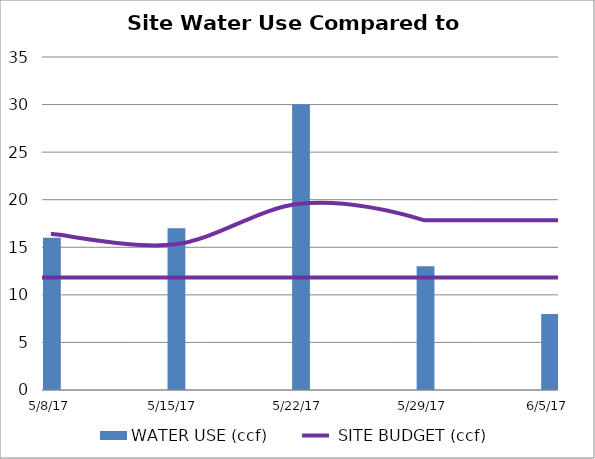
| Category | WATER USE (ccf)  |
|---|---|
| 5/8/17 | 16 |
| 5/15/17 | 17 |
| 5/22/17 | 30 |
| 5/29/17 | 13 |
| 6/5/17 | 8 |
| nan | 0 |
| nan | 0 |
| nan | 0 |
| nan | 0 |
| nan | 0 |
| nan | 0 |
| nan | 0 |
| nan | 0 |
| nan | 0 |
| nan | 0 |
| nan | 0 |
| nan | 0 |
| nan | 0 |
| nan | 0 |
| nan | 0 |
| nan | 0 |
| nan | 0 |
| nan | 0 |
| nan | 0 |
| nan | 0 |
| nan | 0 |
| nan | 0 |
| nan | 0 |
| nan | 0 |
| nan | 0 |
| nan | 0 |
| nan | 0 |
| nan | 0 |
| nan | 0 |
| nan | 0 |
| nan | 0 |
| nan | 0 |
| nan | 0 |
| nan | 0 |
| nan | 0 |
| nan | 0 |
| nan | 0 |
| nan | 0 |
| nan | 0 |
| nan | 0 |
| nan | 0 |
| nan | 0 |
| nan | 0 |
| nan | 0 |
| nan | 0 |
| nan | 0 |
| nan | 0 |
| nan | 0 |
| nan | 0 |
| nan | 0 |
| nan | 0 |
| nan | 0 |
| nan | 0 |
| nan | 0 |
| nan | 0 |
| nan | 0 |
| nan | 0 |
| nan | 0 |
| nan | 0 |
| nan | 0 |
| nan | 0 |
| nan | 0 |
| nan | 0 |
| nan | 0 |
| nan | 0 |
| nan | 0 |
| nan | 0 |
| nan | 0 |
| nan | 0 |
| nan | 0 |
| nan | 0 |
| nan | 0 |
| nan | 0 |
| nan | 0 |
| nan | 0 |
| nan | 0 |
| nan | 0 |
| nan | 0 |
| nan | 0 |
| nan | 0 |
| nan | 0 |
| nan | 0 |
| nan | 0 |
| nan | 0 |
| nan | 0 |
| nan | 0 |
| nan | 0 |
| nan | 0 |
| nan | 0 |
| nan | 0 |
| nan | 0 |
| nan | 0 |
| nan | 0 |
| nan | 0 |
| nan | 0 |
| nan | 0 |
| nan | 0 |
| nan | 0 |
| nan | 0 |
| nan | 0 |
| nan | 0 |
| nan | 0 |
| nan | 0 |
| nan | 0 |
| nan | 0 |
| nan | 0 |
| nan | 0 |
| nan | 0 |
| nan | 0 |
| nan | 0 |
| nan | 0 |
| nan | 0 |
| nan | 0 |
| nan | 0 |
| nan | 0 |
| nan | 0 |
| nan | 0 |
| nan | 0 |
| nan | 0 |
| nan | 0 |
| nan | 0 |
| nan | 0 |
| nan | 0 |
| nan | 0 |
| nan | 0 |
| nan | 0 |
| nan | 0 |
| nan | 0 |
| nan | 0 |
| nan | 0 |
| nan | 0 |
| nan | 0 |
| nan | 0 |
| nan | 0 |
| nan | 0 |
| nan | 0 |
| nan | 0 |
| nan | 0 |
| nan | 0 |
| nan | 0 |
| nan | 0 |
| nan | 0 |
| nan | 0 |
| nan | 0 |
| nan | 0 |
| nan | 0 |
| nan | 0 |
| nan | 0 |
| nan | 0 |
| nan | 0 |
| nan | 0 |
| nan | 0 |
| nan | 0 |
| nan | 0 |
| nan | 0 |
| nan | 0 |
| nan | 0 |
| nan | 0 |
| nan | 0 |
| nan | 0 |
| nan | 0 |
| nan | 0 |
| nan | 0 |
| nan | 0 |
| nan | 0 |
| nan | 0 |
| nan | 0 |
| nan | 0 |
| nan | 0 |
| nan | 0 |
| nan | 0 |
| nan | 0 |
| nan | 0 |
| nan | 0 |
| nan | 0 |
| nan | 0 |
| nan | 0 |
| nan | 0 |
| nan | 0 |
| nan | 0 |
| nan | 0 |
| nan | 0 |
| nan | 0 |
| nan | 0 |
| nan | 0 |
| nan | 0 |
| nan | 0 |
| nan | 0 |
| nan | 0 |
| nan | 0 |
| nan | 0 |
| nan | 0 |
| nan | 0 |
| nan | 0 |
| nan | 0 |
| nan | 0 |
| nan | 0 |
| nan | 0 |
| nan | 0 |
| nan | 0 |
| nan | 0 |
| nan | 0 |
| nan | 0 |
| nan | 0 |
| nan | 0 |
| nan | 0 |
| nan | 0 |
| nan | 0 |
| nan | 0 |
| nan | 0 |
| nan | 0 |
| nan | 0 |
| nan | 0 |
| nan | 0 |
| nan | 0 |
| nan | 0 |
| nan | 0 |
| nan | 0 |
| nan | 0 |
| nan | 0 |
| nan | 0 |
| nan | 0 |
| nan | 0 |
| nan | 0 |
| nan | 0 |
| nan | 0 |
| nan | 0 |
| nan | 0 |
| nan | 0 |
| nan | 0 |
| nan | 0 |
| nan | 0 |
| nan | 0 |
| nan | 0 |
| nan | 0 |
| nan | 0 |
| nan | 0 |
| nan | 0 |
| nan | 0 |
| nan | 0 |
| nan | 0 |
| nan | 0 |
| nan | 0 |
| nan | 0 |
| nan | 0 |
| nan | 0 |
| nan | 0 |
| nan | 0 |
| nan | 0 |
| nan | 0 |
| nan | 0 |
| nan | 0 |
| nan | 0 |
| nan | 0 |
| nan | 0 |
| nan | 0 |
| nan | 0 |
| nan | 0 |
| nan | 0 |
| nan | 0 |
| nan | 0 |
| nan | 0 |
| nan | 0 |
| nan | 0 |
| nan | 0 |
| nan | 0 |
| nan | 0 |
| nan | 0 |
| nan | 0 |
| nan | 0 |
| nan | 0 |
| nan | 0 |
| nan | 0 |
| nan | 0 |
| nan | 0 |
| nan | 0 |
| nan | 0 |
| nan | 0 |
| nan | 0 |
| nan | 0 |
| nan | 0 |
| nan | 0 |
| nan | 0 |
| nan | 0 |
| nan | 0 |
| nan | 0 |
| nan | 0 |
| nan | 0 |
| nan | 0 |
| nan | 0 |
| nan | 0 |
| nan | 0 |
| nan | 0 |
| nan | 0 |
| nan | 0 |
| nan | 0 |
| nan | 0 |
| nan | 0 |
| nan | 0 |
| nan | 0 |
| nan | 0 |
| nan | 0 |
| nan | 0 |
| nan | 0 |
| nan | 0 |
| nan | 0 |
| nan | 0 |
| nan | 0 |
| nan | 0 |
| nan | 0 |
| nan | 0 |
| nan | 0 |
| nan | 0 |
| nan | 0 |
| nan | 0 |
| nan | 0 |
| nan | 0 |
| nan | 0 |
| nan | 0 |
| nan | 0 |
| nan | 0 |
| nan | 0 |
| nan | 0 |
| nan | 0 |
| nan | 0 |
| nan | 0 |
| nan | 0 |
| nan | 0 |
| nan | 0 |
| nan | 0 |
| nan | 0 |
| nan | 0 |
| nan | 0 |
| nan | 0 |
| nan | 0 |
| nan | 0 |
| nan | 0 |
| nan | 0 |
| nan | 0 |
| nan | 0 |
| nan | 0 |
| nan | 0 |
| nan | 0 |
| nan | 0 |
| nan | 0 |
| nan | 0 |
| nan | 0 |
| nan | 0 |
| nan | 0 |
| nan | 0 |
| nan | 0 |
| nan | 0 |
| nan | 0 |
| nan | 0 |
| nan | 0 |
| nan | 0 |
| nan | 0 |
| nan | 0 |
| nan | 0 |
| nan | 0 |
| nan | 0 |
| nan | 0 |
| nan | 0 |
| nan | 0 |
| nan | 0 |
| nan | 0 |
| nan | 0 |
| nan | 0 |
| nan | 0 |
| nan | 0 |
| nan | 0 |
| nan | 0 |
| nan | 0 |
| nan | 0 |
| nan | 0 |
| nan | 0 |
| nan | 0 |
| nan | 0 |
| nan | 0 |
| nan | 0 |
| nan | 0 |
| nan | 0 |
| nan | 0 |
| nan | 0 |
| nan | 0 |
| nan | 0 |
| nan | 0 |
| nan | 0 |
| nan | 0 |
| nan | 0 |
| nan | 0 |
| nan | 0 |
| nan | 0 |
| nan | 0 |
| nan | 0 |
| nan | 0 |
| nan | 0 |
| nan | 0 |
| nan | 0 |
| nan | 0 |
| nan | 0 |
| nan | 0 |
| nan | 0 |
| nan | 0 |
| nan | 0 |
| nan | 0 |
| nan | 0 |
| nan | 0 |
| nan | 0 |
| nan | 0 |
| nan | 0 |
| nan | 0 |
| nan | 0 |
| nan | 0 |
| nan | 0 |
| nan | 0 |
| nan | 0 |
| nan | 0 |
| nan | 0 |
| nan | 0 |
| nan | 0 |
| nan | 0 |
| nan | 0 |
| nan | 0 |
| nan | 0 |
| nan | 0 |
| nan | 0 |
| nan | 0 |
| nan | 0 |
| nan | 0 |
| nan | 0 |
| nan | 0 |
| nan | 0 |
| nan | 0 |
| nan | 0 |
| nan | 0 |
| nan | 0 |
| nan | 0 |
| nan | 0 |
| nan | 0 |
| nan | 0 |
| nan | 0 |
| nan | 0 |
| nan | 0 |
| nan | 0 |
| nan | 0 |
| nan | 0 |
| nan | 0 |
| nan | 0 |
| nan | 0 |
| nan | 0 |
| nan | 0 |
| nan | 0 |
| nan | 0 |
| nan | 0 |
| nan | 0 |
| nan | 0 |
| nan | 0 |
| nan | 0 |
| nan | 0 |
| nan | 0 |
| nan | 0 |
| nan | 0 |
| nan | 0 |
| nan | 0 |
| nan | 0 |
| nan | 0 |
| nan | 0 |
| nan | 0 |
| nan | 0 |
| nan | 0 |
| nan | 0 |
| nan | 0 |
| nan | 0 |
| nan | 0 |
| nan | 0 |
| nan | 0 |
| nan | 0 |
| nan | 0 |
| nan | 0 |
| nan | 0 |
| nan | 0 |
| nan | 0 |
| nan | 0 |
| nan | 0 |
| nan | 0 |
| nan | 0 |
| nan | 0 |
| nan | 0 |
| nan | 0 |
| nan | 0 |
| nan | 0 |
| nan | 0 |
| nan | 0 |
| nan | 0 |
| nan | 0 |
| nan | 0 |
| nan | 0 |
| nan | 0 |
| nan | 0 |
| nan | 0 |
| nan | 0 |
| nan | 0 |
| nan | 0 |
| nan | 0 |
| nan | 0 |
| nan | 0 |
| nan | 0 |
| nan | 0 |
| nan | 0 |
| nan | 0 |
| nan | 0 |
| nan | 0 |
| nan | 0 |
| nan | 0 |
| nan | 0 |
| nan | 0 |
| nan | 0 |
| nan | 0 |
| nan | 0 |
| nan | 0 |
| nan | 0 |
| nan | 0 |
| nan | 0 |
| nan | 0 |
| nan | 0 |
| nan | 0 |
| nan | 0 |
| nan | 0 |
| nan | 0 |
| nan | 0 |
| nan | 0 |
| nan | 0 |
| nan | 0 |
| nan | 0 |
| nan | 0 |
| nan | 0 |
| nan | 0 |
| nan | 0 |
| nan | 0 |
| nan | 0 |
| nan | 0 |
| nan | 0 |
| nan | 0 |
| nan | 0 |
| nan | 0 |
| nan | 0 |
| nan | 0 |
| nan | 0 |
| nan | 0 |
| nan | 0 |
| nan | 0 |
| nan | 0 |
| nan | 0 |
| nan | 0 |
| nan | 0 |
| nan | 0 |
| nan | 0 |
| nan | 0 |
| nan | 0 |
| nan | 0 |
| nan | 0 |
| nan | 0 |
| nan | 0 |
| nan | 0 |
| nan | 0 |
| nan | 0 |
| nan | 0 |
| nan | 0 |
| nan | 0 |
| nan | 0 |
| nan | 0 |
| nan | 0 |
| nan | 0 |
| nan | 0 |
| nan | 0 |
| nan | 0 |
| nan | 0 |
| nan | 0 |
| nan | 0 |
| nan | 0 |
| nan | 0 |
| nan | 0 |
| nan | 0 |
| nan | 0 |
| nan | 0 |
| nan | 0 |
| nan | 0 |
| nan | 0 |
| nan | 0 |
| nan | 0 |
| nan | 0 |
| nan | 0 |
| nan | 0 |
| nan | 0 |
| nan | 0 |
| nan | 0 |
| nan | 0 |
| nan | 0 |
| nan | 0 |
| nan | 0 |
| nan | 0 |
| nan | 0 |
| nan | 0 |
| nan | 0 |
| nan | 0 |
| nan | 0 |
| nan | 0 |
| nan | 0 |
| nan | 0 |
| nan | 0 |
| nan | 0 |
| nan | 0 |
| nan | 0 |
| nan | 0 |
| nan | 0 |
| nan | 0 |
| nan | 0 |
| nan | 0 |
| nan | 0 |
| nan | 0 |
| nan | 0 |
| nan | 0 |
| nan | 0 |
| nan | 0 |
| nan | 0 |
| nan | 0 |
| nan | 0 |
| nan | 0 |
| nan | 0 |
| nan | 0 |
| nan | 0 |
| nan | 0 |
| nan | 0 |
| nan | 0 |
| nan | 0 |
| nan | 0 |
| nan | 0 |
| nan | 0 |
| nan | 0 |
| nan | 0 |
| nan | 0 |
| nan | 0 |
| nan | 0 |
| nan | 0 |
| nan | 0 |
| nan | 0 |
| nan | 0 |
| nan | 0 |
| nan | 0 |
| nan | 0 |
| nan | 0 |
| nan | 0 |
| nan | 0 |
| nan | 0 |
| nan | 0 |
| nan | 0 |
| nan | 0 |
| nan | 0 |
| nan | 0 |
| nan | 0 |
| nan | 0 |
| nan | 0 |
| nan | 0 |
| nan | 0 |
| nan | 0 |
| nan | 0 |
| nan | 0 |
| nan | 0 |
| nan | 0 |
| nan | 0 |
| nan | 0 |
| nan | 0 |
| nan | 0 |
| nan | 0 |
| nan | 0 |
| nan | 0 |
| nan | 0 |
| nan | 0 |
| nan | 0 |
| nan | 0 |
| nan | 0 |
| nan | 0 |
| nan | 0 |
| nan | 0 |
| nan | 0 |
| nan | 0 |
| nan | 0 |
| nan | 0 |
| nan | 0 |
| nan | 0 |
| nan | 0 |
| nan | 0 |
| nan | 0 |
| nan | 0 |
| nan | 0 |
| nan | 0 |
| nan | 0 |
| nan | 0 |
| nan | 0 |
| nan | 0 |
| nan | 0 |
| nan | 0 |
| nan | 0 |
| nan | 0 |
| nan | 0 |
| nan | 0 |
| nan | 0 |
| nan | 0 |
| nan | 0 |
| nan | 0 |
| nan | 0 |
| nan | 0 |
| nan | 0 |
| nan | 0 |
| nan | 0 |
| nan | 0 |
| nan | 0 |
| nan | 0 |
| nan | 0 |
| nan | 0 |
| nan | 0 |
| nan | 0 |
| nan | 0 |
| nan | 0 |
| nan | 0 |
| nan | 0 |
| nan | 0 |
| nan | 0 |
| nan | 0 |
| nan | 0 |
| nan | 0 |
| nan | 0 |
| nan | 0 |
| nan | 0 |
| nan | 0 |
| nan | 0 |
| nan | 0 |
| nan | 0 |
| nan | 0 |
| nan | 0 |
| nan | 0 |
| nan | 0 |
| nan | 0 |
| nan | 0 |
| nan | 0 |
| nan | 0 |
| nan | 0 |
| nan | 0 |
| nan | 0 |
| nan | 0 |
| nan | 0 |
| nan | 0 |
| nan | 0 |
| nan | 0 |
| nan | 0 |
| nan | 0 |
| nan | 0 |
| nan | 0 |
| nan | 0 |
| nan | 0 |
| nan | 0 |
| nan | 0 |
| nan | 0 |
| nan | 0 |
| nan | 0 |
| nan | 0 |
| nan | 0 |
| nan | 0 |
| nan | 0 |
| nan | 0 |
| nan | 0 |
| nan | 0 |
| nan | 0 |
| nan | 0 |
| nan | 0 |
| nan | 0 |
| nan | 0 |
| nan | 0 |
| nan | 0 |
| nan | 0 |
| nan | 0 |
| nan | 0 |
| nan | 0 |
| nan | 0 |
| nan | 0 |
| nan | 0 |
| nan | 0 |
| nan | 0 |
| nan | 0 |
| nan | 0 |
| nan | 0 |
| nan | 0 |
| nan | 0 |
| nan | 0 |
| nan | 0 |
| nan | 0 |
| nan | 0 |
| nan | 0 |
| nan | 0 |
| nan | 0 |
| nan | 0 |
| nan | 0 |
| nan | 0 |
| nan | 0 |
| nan | 0 |
| nan | 0 |
| nan | 0 |
| nan | 0 |
| nan | 0 |
| nan | 0 |
| nan | 0 |
| nan | 0 |
| nan | 0 |
| nan | 0 |
| nan | 0 |
| nan | 0 |
| nan | 0 |
| nan | 0 |
| nan | 0 |
| nan | 0 |
| nan | 0 |
| nan | 0 |
| nan | 0 |
| nan | 0 |
| nan | 0 |
| nan | 0 |
| nan | 0 |
| nan | 0 |
| nan | 0 |
| nan | 0 |
| nan | 0 |
| nan | 0 |
| nan | 0 |
| nan | 0 |
| nan | 0 |
| nan | 0 |
| nan | 0 |
| nan | 0 |
| nan | 0 |
| nan | 0 |
| nan | 0 |
| nan | 0 |
| nan | 0 |
| nan | 0 |
| nan | 0 |
| nan | 0 |
| nan | 0 |
| nan | 0 |
| nan | 0 |
| nan | 0 |
| nan | 0 |
| nan | 0 |
| nan | 0 |
| nan | 0 |
| nan | 0 |
| nan | 0 |
| nan | 0 |
| nan | 0 |
| nan | 0 |
| nan | 0 |
| nan | 0 |
| nan | 0 |
| nan | 0 |
| nan | 0 |
| nan | 0 |
| nan | 0 |
| nan | 0 |
| nan | 0 |
| nan | 0 |
| nan | 0 |
| nan | 0 |
| nan | 0 |
| nan | 0 |
| nan | 0 |
| nan | 0 |
| nan | 0 |
| nan | 0 |
| nan | 0 |
| nan | 0 |
| nan | 0 |
| nan | 0 |
| nan | 0 |
| nan | 0 |
| nan | 0 |
| nan | 0 |
| nan | 0 |
| nan | 0 |
| nan | 0 |
| nan | 0 |
| nan | 0 |
| nan | 0 |
| nan | 0 |
| nan | 0 |
| nan | 0 |
| nan | 0 |
| nan | 0 |
| nan | 0 |
| nan | 0 |
| nan | 0 |
| nan | 0 |
| nan | 0 |
| nan | 0 |
| nan | 0 |
| nan | 0 |
| nan | 0 |
| nan | 0 |
| nan | 0 |
| nan | 0 |
| nan | 0 |
| nan | 0 |
| nan | 0 |
| nan | 0 |
| nan | 0 |
| nan | 0 |
| nan | 0 |
| nan | 0 |
| nan | 0 |
| nan | 0 |
| nan | 0 |
| nan | 0 |
| nan | 0 |
| nan | 0 |
| nan | 0 |
| nan | 0 |
| nan | 0 |
| nan | 0 |
| nan | 0 |
| nan | 0 |
| nan | 0 |
| nan | 0 |
| nan | 0 |
| nan | 0 |
| nan | 0 |
| nan | 0 |
| nan | 0 |
| nan | 0 |
| nan | 0 |
| nan | 0 |
| nan | 0 |
| nan | 0 |
| nan | 0 |
| nan | 0 |
| nan | 0 |
| nan | 0 |
| nan | 0 |
| nan | 0 |
| nan | 0 |
| nan | 0 |
| nan | 0 |
| nan | 0 |
| nan | 0 |
| nan | 0 |
| nan | 0 |
| nan | 0 |
| nan | 0 |
| nan | 0 |
| nan | 0 |
| nan | 0 |
| nan | 0 |
| nan | 0 |
| nan | 0 |
| nan | 0 |
| nan | 0 |
| nan | 0 |
| nan | 0 |
| nan | 0 |
| nan | 0 |
| nan | 0 |
| nan | 0 |
| nan | 0 |
| nan | 0 |
| nan | 0 |
| nan | 0 |
| nan | 0 |
| nan | 0 |
| nan | 0 |
| nan | 0 |
| nan | 0 |
| nan | 0 |
| nan | 0 |
| nan | 0 |
| nan | 0 |